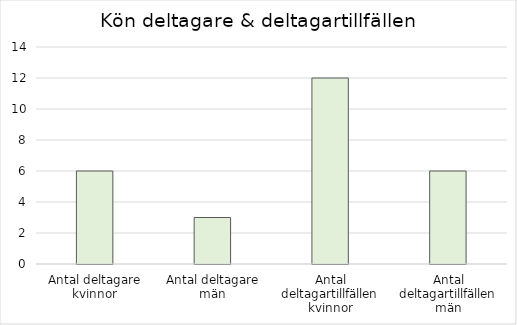
| Category | Series 0 |
|---|---|
| Antal deltagare kvinnor | 6 |
| Antal deltagare män | 3 |
| Antal deltagartillfällen kvinnor | 12 |
| Antal deltagartillfällen män | 6 |